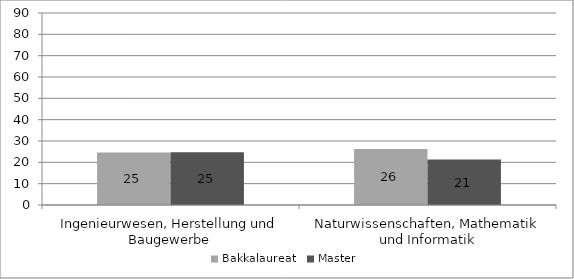
| Category | Bakkalaureat | Master |
|---|---|---|
| Ingenieurwesen, Herstellung und Baugewerbe | 24.601 | 24.762 |
| Naturwissenschaften, Mathematik und Informatik | 26.281 | 21.329 |